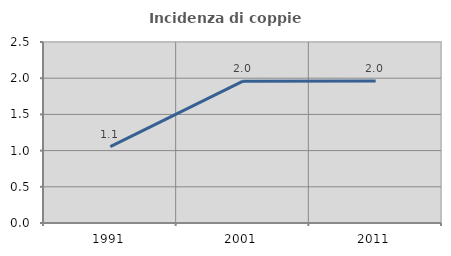
| Category | Incidenza di coppie miste |
|---|---|
| 1991.0 | 1.054 |
| 2001.0 | 1.958 |
| 2011.0 | 1.96 |